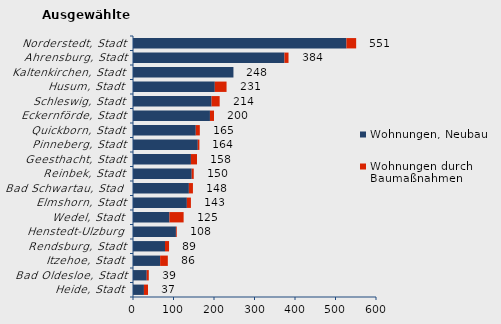
| Category | Wohnungen, Neubau | Wohnungen durch Baumaßnahmen | Series 2 |
|---|---|---|---|
| Heide, Stadt | 27 | 10 | 37 |
| Bad Oldesloe, Stadt | 34 | 5 | 39 |
| Itzehoe, Stadt | 67 | 19 | 86 |
| Rendsburg, Stadt | 79 | 10 | 89 |
| Henstedt-Ulzburg | 106 | 2 | 108 |
| Wedel, Stadt | 90 | 35 | 125 |
| Elmshorn, Stadt | 133 | 10 | 143 |
| Bad Schwartau, Stadt | 138 | 10 | 148 |
| Reinbek, Stadt | 145 | 5 | 150 |
| Geesthacht, Stadt | 143 | 15 | 158 |
| Pinneberg, Stadt | 160 | 4 | 164 |
| Quickborn, Stadt | 155 | 10 | 165 |
| Eckernförde, Stadt | 190 | 10 | 200 |
| Schleswig, Stadt | 194 | 20 | 214 |
| Husum, Stadt | 202 | 29 | 231 |
| Kaltenkirchen, Stadt | 248 | 0 | 248 |
| Ahrensburg, Stadt | 374 | 10 | 384 |
| Norderstedt, Stadt | 527 | 24 | 551 |